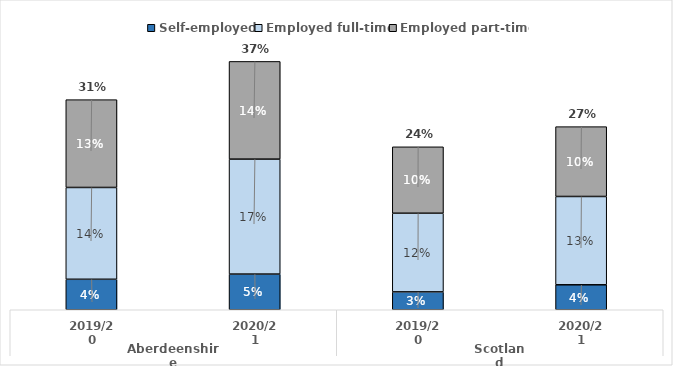
| Category | Self-employed | Employed full-time | Employed part-time |
|---|---|---|---|
| 0 | 0.045 | 0.135 | 0.129 |
| 1 | 0.052 | 0.169 | 0.144 |
| 2 | 0.026 | 0.116 | 0.098 |
| 3 | 0.037 | 0.13 | 0.103 |